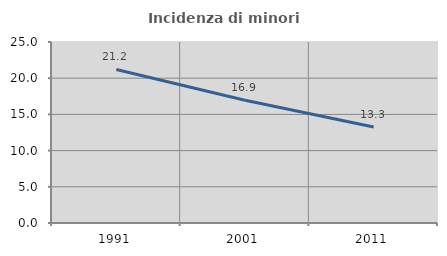
| Category | Incidenza di minori stranieri |
|---|---|
| 1991.0 | 21.212 |
| 2001.0 | 16.949 |
| 2011.0 | 13.265 |